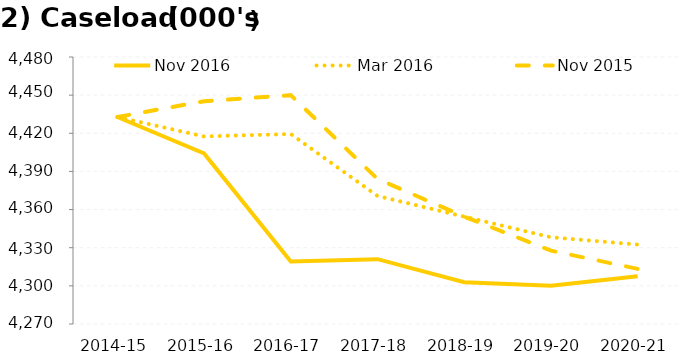
| Category | Nov 2016 | Mar 2016 | Nov 2015 |
|---|---|---|---|
| 2014-15 | 0.885 | 0.885 | 0.885 |
| 2015-16 | 0.694 | 0.783 | 0.968 |
| 2016-17 | 0.127 | 0.796 | 1 |
| 2017-18 | 0.14 | 0.471 | 0.561 |
| 2018-19 | 0.019 | 0.363 | 0.363 |
| 2019-20 | 0 | 0.255 | 0.185 |
| 2020-21 | 0.051 | 0.217 | 0.089 |